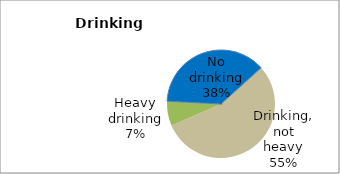
| Category | Series 0 |
|---|---|
| No drinking | 37.493 |
| Drinking, not heavy | 55.128 |
| Heavy drinking | 7.379 |